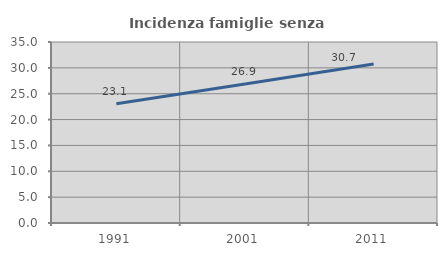
| Category | Incidenza famiglie senza nuclei |
|---|---|
| 1991.0 | 23.06 |
| 2001.0 | 26.881 |
| 2011.0 | 30.74 |